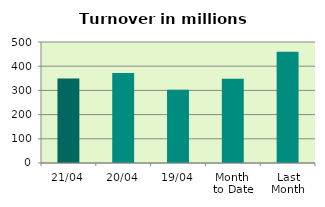
| Category | Series 0 |
|---|---|
| 21/04 | 349.036 |
| 20/04 | 371.783 |
| 19/04 | 302.414 |
| Month 
to Date | 347.861 |
| Last
Month | 459.546 |